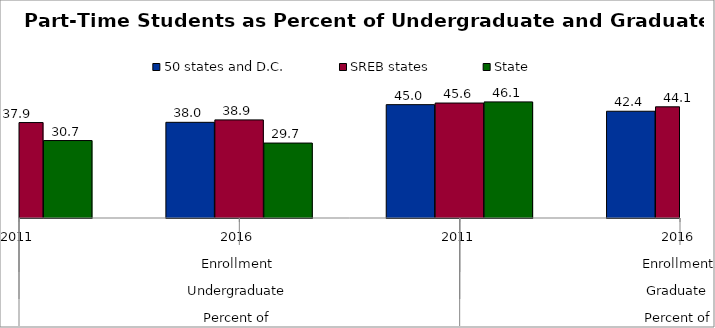
| Category | 50 states and D.C. | SREB states | State |
|---|---|---|---|
| 0 | 37.485 | 37.872 | 30.739 |
| 1 | 37.966 | 38.932 | 29.74 |
| 2 | 44.978 | 45.616 | 46.071 |
| 3 | 42.365 | 44.12 | 40.405 |